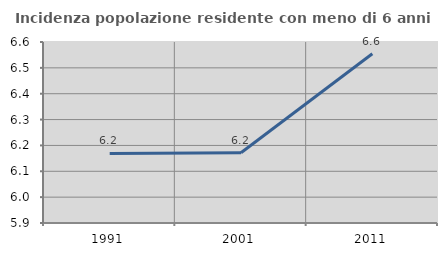
| Category | Incidenza popolazione residente con meno di 6 anni |
|---|---|
| 1991.0 | 6.169 |
| 2001.0 | 6.171 |
| 2011.0 | 6.555 |